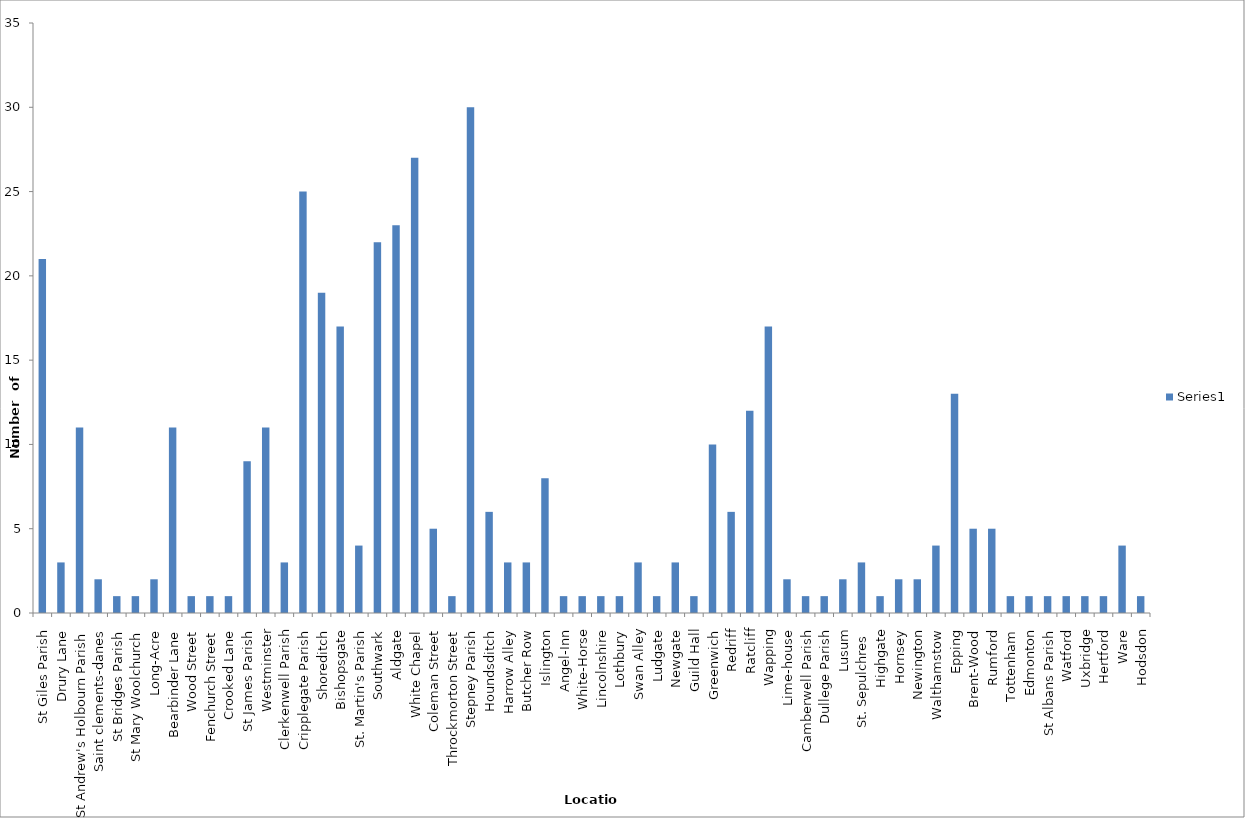
| Category | Series 0 |
|---|---|
| St Giles Parish | 21 |
| Drury Lane | 3 |
| St Andrew's Holbourn Parish | 11 |
| Saint clements-danes | 2 |
| St Bridges Parish | 1 |
| St Mary Woolchurch | 1 |
| Long-Acre | 2 |
| Bearbinder Lane | 11 |
| Wood Street | 1 |
| Fenchurch Street | 1 |
| Crooked Lane | 1 |
| St James Parish | 9 |
| Westminster | 11 |
| Clerkenwell Parish | 3 |
| Cripplegate Parish | 25 |
| Shoreditch | 19 |
| Bishopsgate | 17 |
| St. Martin's Parish | 4 |
| Southwark | 22 |
| Aldgate | 23 |
| White Chapel | 27 |
| Coleman Street | 5 |
| Throckmorton Street | 1 |
| Stepney Parish | 30 |
| Houndsditch | 6 |
| Harrow Alley | 3 |
| Butcher Row | 3 |
| Islington | 8 |
| Angel-Inn | 1 |
| White-Horse | 1 |
| Lincolnshire | 1 |
| Lothbury | 1 |
| Swan Alley | 3 |
| Ludgate | 1 |
| Newgate | 3 |
| Guild Hall | 1 |
| Greenwich | 10 |
| Redriff | 6 |
| Ratcliff | 12 |
| Wapping | 17 |
| Lime-house | 2 |
| Camberwell Parish | 1 |
| Dullege Parish | 1 |
| Lusum | 2 |
| St. Sepulchres  | 3 |
| Highgate | 1 |
| Hornsey | 2 |
| Newington | 2 |
| Walthamstow | 4 |
| Epping | 13 |
| Brent-Wood | 5 |
| Rumford | 5 |
| Tottenham | 1 |
| Edmonton | 1 |
| St Albans Parish | 1 |
| Watford | 1 |
| Uxbridge | 1 |
| Hertford | 1 |
| Ware | 4 |
| Hodsdon | 1 |